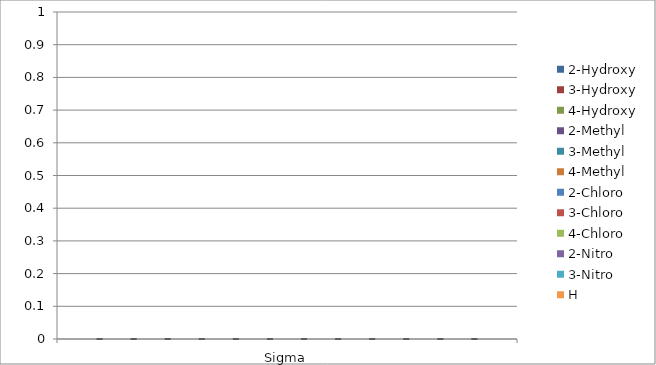
| Category | 2-Hydroxy | 3-Hydroxy | 4-Hydroxy | 2-Methyl | 3-Methyl | 4-Methyl | 2-Chloro | 3-Chloro | 4-Chloro | 2-Nitro | 3-Nitro | H |
|---|---|---|---|---|---|---|---|---|---|---|---|---|
| Sigma | 0 | 0 | 0 | 0 | 0 | 0 | 0 | 0 | 0 | 0 | 0 | 0 |